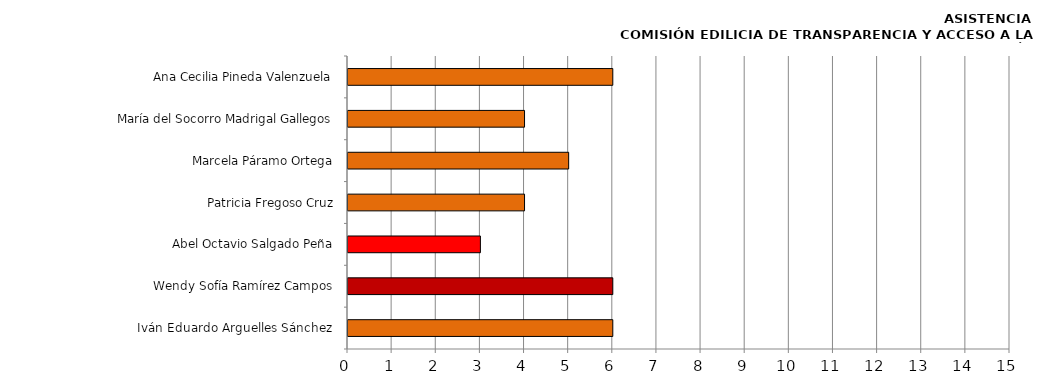
| Category | Series 0 |
|---|---|
| Iván Eduardo Arguelles Sánchez  | 6 |
| Wendy Sofía Ramírez Campos | 6 |
| Abel Octavio Salgado Peña | 3 |
| Patricia Fregoso Cruz | 4 |
| Marcela Páramo Ortega | 5 |
| María del Socorro Madrigal Gallegos | 4 |
| Ana Cecilia Pineda Valenzuela | 6 |